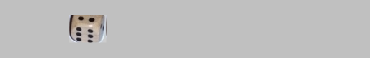
| Category | 1 | 2 | 3 | 4 | 5 | 6 |
|---|---|---|---|---|---|---|
|  | 0 | 0 | 0 | 0 | 0 | 0 |
| 4 | 0 | 0 | 0 | 1 | 0 | 0 |